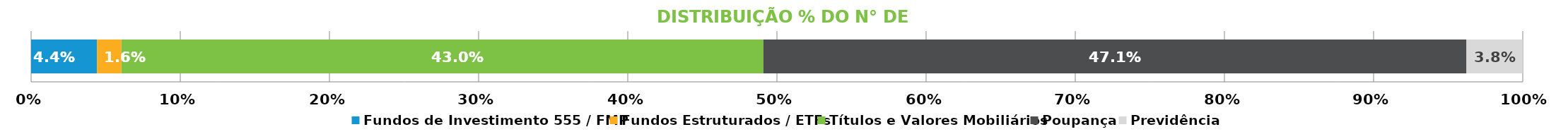
| Category | Fundos de Investimento 555 / FMP | Fundos Estruturados / ETFs | Títulos e Valores Mobiliários | Poupança | Previdência |
|---|---|---|---|---|---|
| 0 | 0.044 | 0.016 | 0.43 | 0.471 | 0.038 |